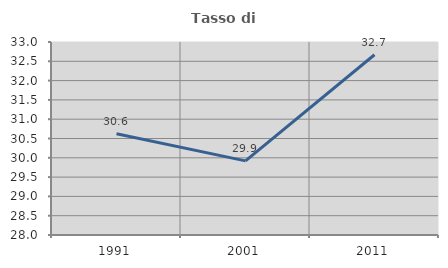
| Category | Tasso di occupazione   |
|---|---|
| 1991.0 | 30.622 |
| 2001.0 | 29.92 |
| 2011.0 | 32.67 |